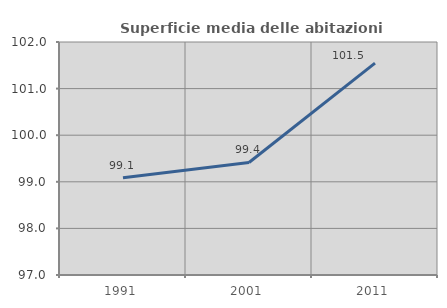
| Category | Superficie media delle abitazioni occupate |
|---|---|
| 1991.0 | 99.088 |
| 2001.0 | 99.415 |
| 2011.0 | 101.545 |